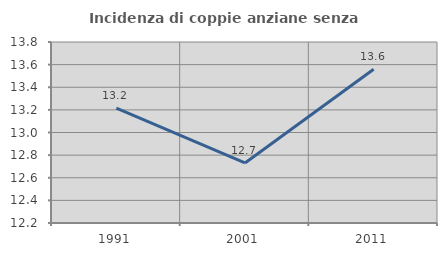
| Category | Incidenza di coppie anziane senza figli  |
|---|---|
| 1991.0 | 13.216 |
| 2001.0 | 12.731 |
| 2011.0 | 13.559 |